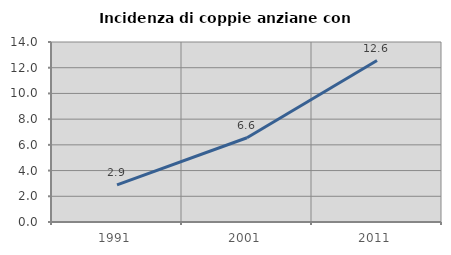
| Category | Incidenza di coppie anziane con figli |
|---|---|
| 1991.0 | 2.881 |
| 2001.0 | 6.55 |
| 2011.0 | 12.556 |